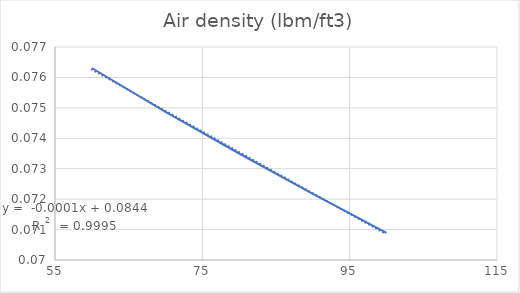
| Category | Air density (lbm/ft3) |
|---|---|
| 100.0 | 0.071 |
| 90.0 | 0.072 |
| 80.0 | 0.074 |
| 70.0 | 0.075 |
| 60.0 | 0.076 |